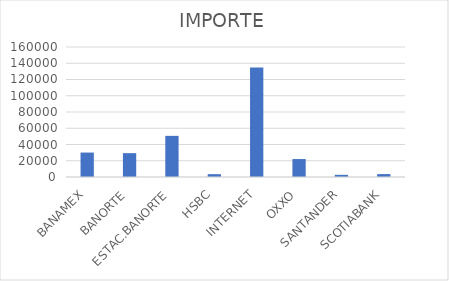
| Category | IMPORTE |
|---|---|
| BANAMEX | 30076.06 |
| BANORTE | 29354.19 |
| ESTAC.BANORTE | 50627.5 |
| HSBC | 3488.68 |
| INTERNET | 134703.46 |
| OXXO | 22088.75 |
| SANTANDER | 2655.67 |
| SCOTIABANK | 3570.96 |